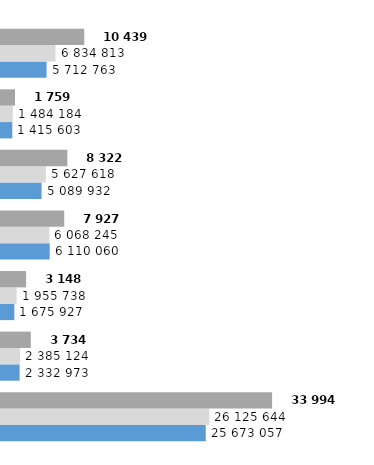
| Category | 2018 | 2019 | 2020 |
|---|---|---|---|
| Farina bianca | 25673056.9 | 26125644.2 | 33994437.9 |
| Farina semibianca | 2332973 | 2385124 | 3734796.1 |
| Farina bigia | 1675927.1 | 1955738 | 3148934 |
| Farina per treccia | 6110060.4 | 6068245 | 7927462 |
| Farina di spelta | 5089931.5 | 5627618.3 | 8322870.2 |
| Farina per spätzli | 1415602.7 | 1484183.7 | 1759333.1 |
| Resto | 5712763.3 | 6834813.1 | 10439191.4 |